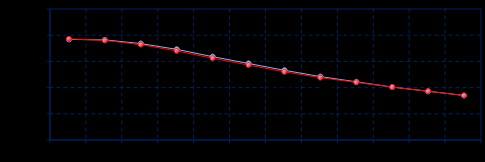
| Category | Series 0 | Series 1 |
|---|---|---|
| Mar 15 | 99.42 | 99.43 |
| Jun 15 | 99.41 | 99.4 |
| Sep 15 | 99.34 | 99.32 |
| Dec 15 | 99.23 | 99.2 |
| Mar 16 | 99.09 | 99.06 |
| Jun 16 | 98.96 | 98.93 |
| Sep 16 | 98.83 | 98.8 |
| Dec 16 | 98.71 | 98.69 |
| Mar 17 | 98.61 | 98.6 |
| Jun 17 | 98.51 | 98.51 |
| Sep 17 | 98.43 | 98.43 |
| Dec 17 | 98.35 | 98.35 |